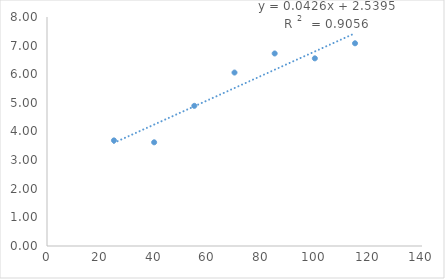
| Category | Series 0 |
|---|---|
| 25.0 | 3.689 |
| 40.0 | 3.622 |
| 55.0 | 4.896 |
| 70.0 | 6.059 |
| 85.0 | 6.726 |
| 100.0 | 6.556 |
| 115.0 | 7.081 |